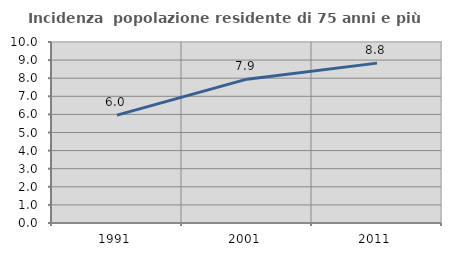
| Category | Incidenza  popolazione residente di 75 anni e più |
|---|---|
| 1991.0 | 5.962 |
| 2001.0 | 7.947 |
| 2011.0 | 8.833 |